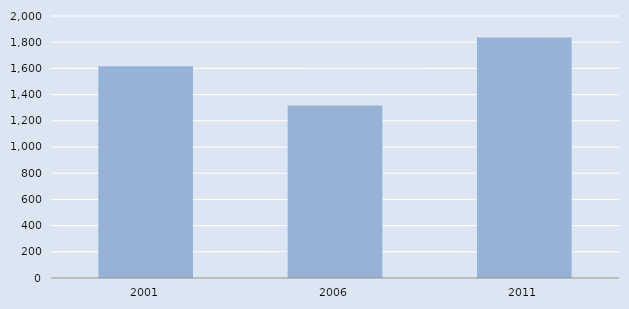
| Category | Series 0 |
|---|---|
| 2001.0 | 1616 |
| 2006.0 | 1316 |
| 2011.0 | 1835 |